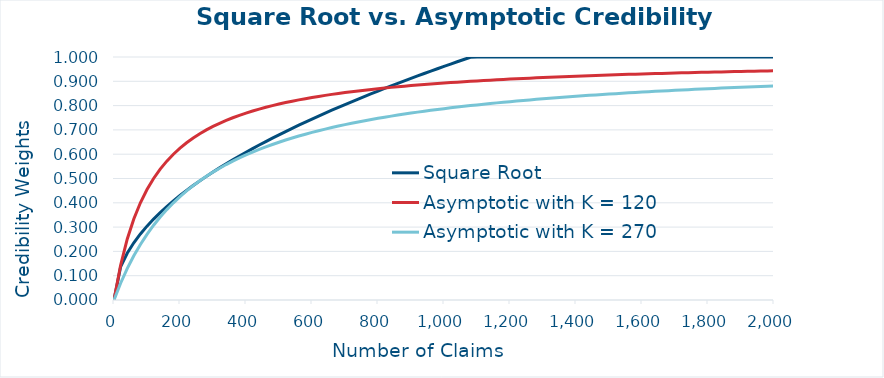
| Category | Square Root | Asymptotic with K = 120 | Asymptotic with K = 270 |
|---|---|---|---|
| 0.0 | 0 | 0 | 0 |
| 20.0 | 0.136 | 0.143 | 0.069 |
| 40.0 | 0.192 | 0.25 | 0.129 |
| 60.0 | 0.235 | 0.333 | 0.182 |
| 80.0 | 0.272 | 0.4 | 0.229 |
| 100.0 | 0.304 | 0.455 | 0.27 |
| 120.0 | 0.333 | 0.5 | 0.308 |
| 140.0 | 0.36 | 0.538 | 0.341 |
| 160.0 | 0.385 | 0.571 | 0.372 |
| 180.0 | 0.408 | 0.6 | 0.4 |
| 200.0 | 0.43 | 0.625 | 0.426 |
| 220.0 | 0.451 | 0.647 | 0.449 |
| 240.0 | 0.471 | 0.667 | 0.471 |
| 260.0 | 0.49 | 0.684 | 0.491 |
| 280.0 | 0.509 | 0.7 | 0.509 |
| 300.0 | 0.527 | 0.714 | 0.526 |
| 320.0 | 0.544 | 0.727 | 0.542 |
| 340.0 | 0.561 | 0.739 | 0.557 |
| 360.0 | 0.577 | 0.75 | 0.571 |
| 380.0 | 0.593 | 0.76 | 0.585 |
| 400.0 | 0.608 | 0.769 | 0.597 |
| 420.0 | 0.623 | 0.778 | 0.609 |
| 440.0 | 0.638 | 0.786 | 0.62 |
| 460.0 | 0.652 | 0.793 | 0.63 |
| 480.0 | 0.666 | 0.8 | 0.64 |
| 500.0 | 0.68 | 0.806 | 0.649 |
| 520.0 | 0.693 | 0.812 | 0.658 |
| 540.0 | 0.706 | 0.818 | 0.667 |
| 560.0 | 0.719 | 0.824 | 0.675 |
| 580.0 | 0.732 | 0.829 | 0.682 |
| 600.0 | 0.745 | 0.833 | 0.69 |
| 620.0 | 0.757 | 0.838 | 0.697 |
| 640.0 | 0.769 | 0.842 | 0.703 |
| 660.0 | 0.781 | 0.846 | 0.71 |
| 680.0 | 0.793 | 0.85 | 0.716 |
| 700.0 | 0.804 | 0.854 | 0.722 |
| 720.0 | 0.816 | 0.857 | 0.727 |
| 740.0 | 0.827 | 0.86 | 0.733 |
| 760.0 | 0.838 | 0.864 | 0.738 |
| 780.0 | 0.849 | 0.867 | 0.743 |
| 800.0 | 0.86 | 0.87 | 0.748 |
| 820.0 | 0.871 | 0.872 | 0.752 |
| 840.0 | 0.881 | 0.875 | 0.757 |
| 860.0 | 0.892 | 0.878 | 0.761 |
| 880.0 | 0.902 | 0.88 | 0.765 |
| 900.0 | 0.912 | 0.882 | 0.769 |
| 920.0 | 0.922 | 0.885 | 0.773 |
| 940.0 | 0.932 | 0.887 | 0.777 |
| 960.0 | 0.942 | 0.889 | 0.78 |
| 980.0 | 0.952 | 0.891 | 0.784 |
| 1000.0 | 0.961 | 0.893 | 0.787 |
| 1020.0 | 0.971 | 0.895 | 0.791 |
| 1040.0 | 0.98 | 0.897 | 0.794 |
| 1060.0 | 0.99 | 0.898 | 0.797 |
| 1080.0 | 0.999 | 0.9 | 0.8 |
| 1100.0 | 1 | 0.902 | 0.803 |
| 1120.0 | 1 | 0.903 | 0.806 |
| 1140.0 | 1 | 0.905 | 0.809 |
| 1160.0 | 1 | 0.906 | 0.811 |
| 1180.0 | 1 | 0.908 | 0.814 |
| 1200.0 | 1 | 0.909 | 0.816 |
| 1220.0 | 1 | 0.91 | 0.819 |
| 1240.0 | 1 | 0.912 | 0.821 |
| 1260.0 | 1 | 0.913 | 0.824 |
| 1280.0 | 1 | 0.914 | 0.826 |
| 1300.0 | 1 | 0.915 | 0.828 |
| 1320.0 | 1 | 0.917 | 0.83 |
| 1340.0 | 1 | 0.918 | 0.832 |
| 1360.0 | 1 | 0.919 | 0.834 |
| 1380.0 | 1 | 0.92 | 0.836 |
| 1400.0 | 1 | 0.921 | 0.838 |
| 1420.0 | 1 | 0.922 | 0.84 |
| 1440.0 | 1 | 0.923 | 0.842 |
| 1460.0 | 1 | 0.924 | 0.844 |
| 1480.0 | 1 | 0.925 | 0.846 |
| 1500.0 | 1 | 0.926 | 0.847 |
| 1520.0 | 1 | 0.927 | 0.849 |
| 1540.0 | 1 | 0.928 | 0.851 |
| 1560.0 | 1 | 0.929 | 0.852 |
| 1580.0 | 1 | 0.929 | 0.854 |
| 1600.0 | 1 | 0.93 | 0.856 |
| 1620.0 | 1 | 0.931 | 0.857 |
| 1640.0 | 1 | 0.932 | 0.859 |
| 1660.0 | 1 | 0.933 | 0.86 |
| 1680.0 | 1 | 0.933 | 0.862 |
| 1700.0 | 1 | 0.934 | 0.863 |
| 1720.0 | 1 | 0.935 | 0.864 |
| 1740.0 | 1 | 0.935 | 0.866 |
| 1760.0 | 1 | 0.936 | 0.867 |
| 1780.0 | 1 | 0.937 | 0.868 |
| 1800.0 | 1 | 0.938 | 0.87 |
| 1820.0 | 1 | 0.938 | 0.871 |
| 1840.0 | 1 | 0.939 | 0.872 |
| 1860.0 | 1 | 0.939 | 0.873 |
| 1880.0 | 1 | 0.94 | 0.874 |
| 1900.0 | 1 | 0.941 | 0.876 |
| 1920.0 | 1 | 0.941 | 0.877 |
| 1940.0 | 1 | 0.942 | 0.878 |
| 1960.0 | 1 | 0.942 | 0.879 |
| 1980.0 | 1 | 0.943 | 0.88 |
| 2000.0 | 1 | 0.943 | 0.881 |